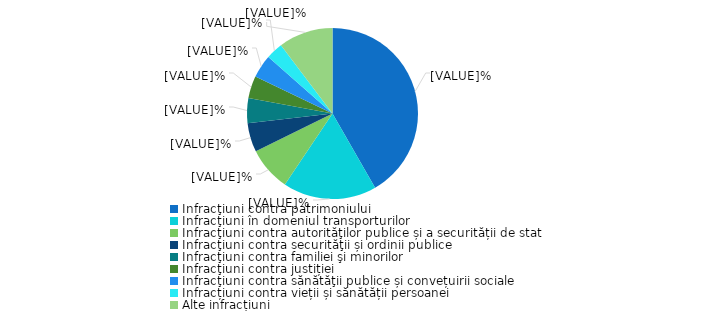
| Category | Series 0 |
|---|---|
| Infracţiuni contra patrimoniului | 41.7 |
| Infracţiuni în domeniul transporturilor | 17.7 |
| Infracţiuni contra autorităţilor publice și a securității de stat | 8.3 |
| Infracţiuni contra securităţii și ordinii publice  | 5.5 |
| Infracţiuni contra familiei şi minorilor | 4.7 |
| Infracţiuni contra justiției | 4.2 |
| Infracţiuni contra sănătăţii publice și convețuirii sociale | 4.4 |
| Infracțiuni contra vieții și sănătății persoanei | 3.2 |
| Alte infracțiuni | 10.3 |